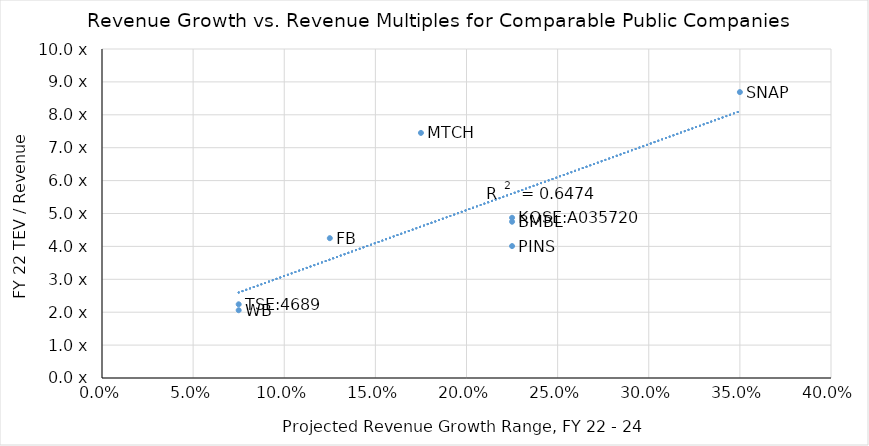
| Category | Series 0 |
|---|---|
| 0.125 | 4.25 |
| 0.225 | 4.01 |
| 0.35 | 8.69 |
| 0.075 | 2.24 |
| 0.175 | 7.45 |
| 0.225 | 4.75 |
| 0.225 | 4.87 |
| 0.075 | 2.06 |